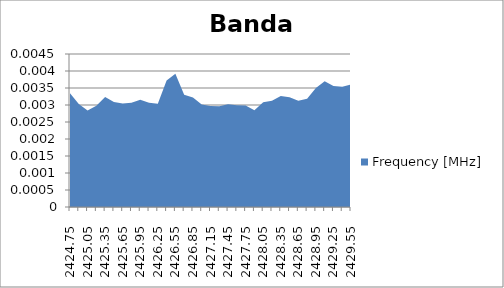
| Category | Frequency [MHz] |
|---|---|
| 2424.75 | 0.003 |
| 2424.9 | 0.003 |
| 2425.05 | 0.003 |
| 2425.2 | 0.003 |
| 2425.35 | 0.003 |
| 2425.5 | 0.003 |
| 2425.65 | 0.003 |
| 2425.8 | 0.003 |
| 2425.95 | 0.003 |
| 2426.1 | 0.003 |
| 2426.25 | 0.003 |
| 2426.4 | 0.004 |
| 2426.55 | 0.004 |
| 2426.7 | 0.003 |
| 2426.85 | 0.003 |
| 2427.0 | 0.003 |
| 2427.15 | 0.003 |
| 2427.3 | 0.003 |
| 2427.45 | 0.003 |
| 2427.6 | 0.003 |
| 2427.75 | 0.003 |
| 2427.9 | 0.003 |
| 2428.05 | 0.003 |
| 2428.2 | 0.003 |
| 2428.35 | 0.003 |
| 2428.5 | 0.003 |
| 2428.65 | 0.003 |
| 2428.8 | 0.003 |
| 2428.95 | 0.003 |
| 2429.1 | 0.004 |
| 2429.25 | 0.004 |
| 2429.4 | 0.004 |
| 2429.55 | 0.004 |